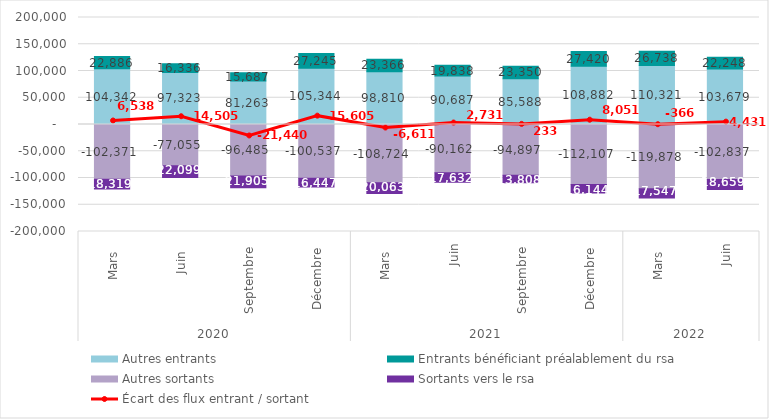
| Category |  Autres entrants  |  Entrants bénéficiant préalablement du rsa  |  Autres sortants  |  Sortants vers le rsa  |
|---|---|---|---|---|
| 0 | 104342 | 22886 | -102371 | -18319 |
| 1 | 97323 | 16336 | -77055 | -22099 |
| 2 | 81263 | 15687 | -96485 | -21905 |
| 3 | 105344 | 27245 | -100537 | -16447 |
| 4 | 98810 | 23366 | -108724 | -20063 |
| 5 | 90687 | 19838 | -90162 | -17632 |
| 6 | 85588 | 23350 | -94897 | -13808 |
| 7 | 108882 | 27420 | -112107 | -16144 |
| 8 | 110321 | 26738 | -119878 | -17547 |
| 9 | 103679 | 22248 | -102837 | -18659 |